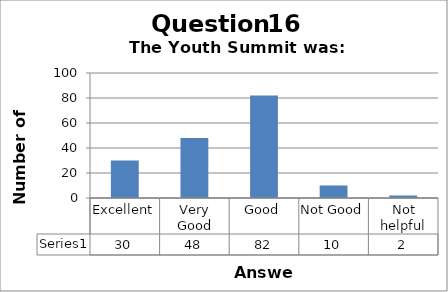
| Category | Series 0 |
|---|---|
| Excellent | 30 |
| Very Good | 48 |
| Good | 82 |
| Not Good | 10 |
| Not helpful | 2 |